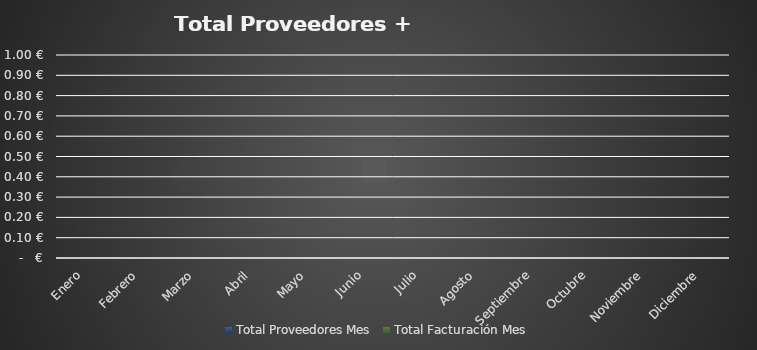
| Category | Total Proveedores Mes | Total Facturación Mes |
|---|---|---|
| Enero | 0 | 0 |
| Febrero | 0 | 0 |
| Marzo | 0 | 0 |
| Abril | 0 | 0 |
| Mayo | 0 | 0 |
| Junio | 0 | 0 |
| Julio | 0 | 0 |
| Agosto | 0 | 0 |
| Septiembre | 0 | 0 |
| Octubre | 0 | 0 |
| Noviembre | 0 | 0 |
| Diciembre | 0 | 0 |